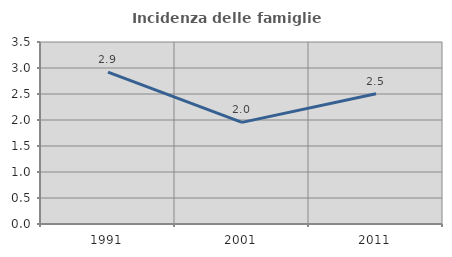
| Category | Incidenza delle famiglie numerose |
|---|---|
| 1991.0 | 2.92 |
| 2001.0 | 1.954 |
| 2011.0 | 2.505 |